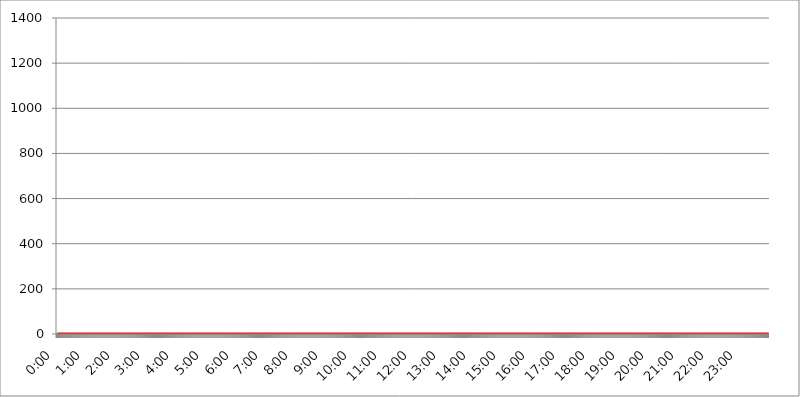
| Category | 2018.04.15. Intenzitás [W/m^2] |
|---|---|
| 0.0 | 0 |
| 0.0006944444444444445 | 0 |
| 0.001388888888888889 | 0 |
| 0.0020833333333333333 | 0 |
| 0.002777777777777778 | 0 |
| 0.003472222222222222 | 0 |
| 0.004166666666666667 | 0 |
| 0.004861111111111111 | 0 |
| 0.005555555555555556 | 0 |
| 0.0062499999999999995 | 0 |
| 0.006944444444444444 | 0 |
| 0.007638888888888889 | 0 |
| 0.008333333333333333 | 0 |
| 0.009027777777777779 | 0 |
| 0.009722222222222222 | 0 |
| 0.010416666666666666 | 0 |
| 0.011111111111111112 | 0 |
| 0.011805555555555555 | 0 |
| 0.012499999999999999 | 0 |
| 0.013194444444444444 | 0 |
| 0.013888888888888888 | 0 |
| 0.014583333333333332 | 0 |
| 0.015277777777777777 | 0 |
| 0.015972222222222224 | 0 |
| 0.016666666666666666 | 0 |
| 0.017361111111111112 | 0 |
| 0.018055555555555557 | 0 |
| 0.01875 | 0 |
| 0.019444444444444445 | 0 |
| 0.02013888888888889 | 0 |
| 0.020833333333333332 | 0 |
| 0.02152777777777778 | 0 |
| 0.022222222222222223 | 0 |
| 0.02291666666666667 | 0 |
| 0.02361111111111111 | 0 |
| 0.024305555555555556 | 0 |
| 0.024999999999999998 | 0 |
| 0.025694444444444447 | 0 |
| 0.02638888888888889 | 0 |
| 0.027083333333333334 | 0 |
| 0.027777777777777776 | 0 |
| 0.02847222222222222 | 0 |
| 0.029166666666666664 | 0 |
| 0.029861111111111113 | 0 |
| 0.030555555555555555 | 0 |
| 0.03125 | 0 |
| 0.03194444444444445 | 0 |
| 0.03263888888888889 | 0 |
| 0.03333333333333333 | 0 |
| 0.034027777777777775 | 0 |
| 0.034722222222222224 | 0 |
| 0.035416666666666666 | 0 |
| 0.036111111111111115 | 0 |
| 0.03680555555555556 | 0 |
| 0.0375 | 0 |
| 0.03819444444444444 | 0 |
| 0.03888888888888889 | 0 |
| 0.03958333333333333 | 0 |
| 0.04027777777777778 | 0 |
| 0.04097222222222222 | 0 |
| 0.041666666666666664 | 0 |
| 0.042361111111111106 | 0 |
| 0.04305555555555556 | 0 |
| 0.043750000000000004 | 0 |
| 0.044444444444444446 | 0 |
| 0.04513888888888889 | 0 |
| 0.04583333333333334 | 0 |
| 0.04652777777777778 | 0 |
| 0.04722222222222222 | 0 |
| 0.04791666666666666 | 0 |
| 0.04861111111111111 | 0 |
| 0.049305555555555554 | 0 |
| 0.049999999999999996 | 0 |
| 0.05069444444444445 | 0 |
| 0.051388888888888894 | 0 |
| 0.052083333333333336 | 0 |
| 0.05277777777777778 | 0 |
| 0.05347222222222222 | 0 |
| 0.05416666666666667 | 0 |
| 0.05486111111111111 | 0 |
| 0.05555555555555555 | 0 |
| 0.05625 | 0 |
| 0.05694444444444444 | 0 |
| 0.057638888888888885 | 0 |
| 0.05833333333333333 | 0 |
| 0.05902777777777778 | 0 |
| 0.059722222222222225 | 0 |
| 0.06041666666666667 | 0 |
| 0.061111111111111116 | 0 |
| 0.06180555555555556 | 0 |
| 0.0625 | 0 |
| 0.06319444444444444 | 0 |
| 0.06388888888888888 | 0 |
| 0.06458333333333334 | 0 |
| 0.06527777777777778 | 0 |
| 0.06597222222222222 | 0 |
| 0.06666666666666667 | 0 |
| 0.06736111111111111 | 0 |
| 0.06805555555555555 | 0 |
| 0.06874999999999999 | 0 |
| 0.06944444444444443 | 0 |
| 0.07013888888888889 | 0 |
| 0.07083333333333333 | 0 |
| 0.07152777777777779 | 0 |
| 0.07222222222222223 | 0 |
| 0.07291666666666667 | 0 |
| 0.07361111111111111 | 0 |
| 0.07430555555555556 | 0 |
| 0.075 | 0 |
| 0.07569444444444444 | 0 |
| 0.0763888888888889 | 0 |
| 0.07708333333333334 | 0 |
| 0.07777777777777778 | 0 |
| 0.07847222222222222 | 0 |
| 0.07916666666666666 | 0 |
| 0.0798611111111111 | 0 |
| 0.08055555555555556 | 0 |
| 0.08125 | 0 |
| 0.08194444444444444 | 0 |
| 0.08263888888888889 | 0 |
| 0.08333333333333333 | 0 |
| 0.08402777777777777 | 0 |
| 0.08472222222222221 | 0 |
| 0.08541666666666665 | 0 |
| 0.08611111111111112 | 0 |
| 0.08680555555555557 | 0 |
| 0.08750000000000001 | 0 |
| 0.08819444444444445 | 0 |
| 0.08888888888888889 | 0 |
| 0.08958333333333333 | 0 |
| 0.09027777777777778 | 0 |
| 0.09097222222222222 | 0 |
| 0.09166666666666667 | 0 |
| 0.09236111111111112 | 0 |
| 0.09305555555555556 | 0 |
| 0.09375 | 0 |
| 0.09444444444444444 | 0 |
| 0.09513888888888888 | 0 |
| 0.09583333333333333 | 0 |
| 0.09652777777777777 | 0 |
| 0.09722222222222222 | 0 |
| 0.09791666666666667 | 0 |
| 0.09861111111111111 | 0 |
| 0.09930555555555555 | 0 |
| 0.09999999999999999 | 0 |
| 0.10069444444444443 | 0 |
| 0.1013888888888889 | 0 |
| 0.10208333333333335 | 0 |
| 0.10277777777777779 | 0 |
| 0.10347222222222223 | 0 |
| 0.10416666666666667 | 0 |
| 0.10486111111111111 | 0 |
| 0.10555555555555556 | 0 |
| 0.10625 | 0 |
| 0.10694444444444444 | 0 |
| 0.1076388888888889 | 0 |
| 0.10833333333333334 | 0 |
| 0.10902777777777778 | 0 |
| 0.10972222222222222 | 0 |
| 0.1111111111111111 | 0 |
| 0.11180555555555556 | 0 |
| 0.11180555555555556 | 0 |
| 0.1125 | 0 |
| 0.11319444444444444 | 0 |
| 0.11388888888888889 | 0 |
| 0.11458333333333333 | 0 |
| 0.11527777777777777 | 0 |
| 0.11597222222222221 | 0 |
| 0.11666666666666665 | 0 |
| 0.1173611111111111 | 0 |
| 0.11805555555555557 | 0 |
| 0.11944444444444445 | 0 |
| 0.12013888888888889 | 0 |
| 0.12083333333333333 | 0 |
| 0.12152777777777778 | 0 |
| 0.12222222222222223 | 0 |
| 0.12291666666666667 | 0 |
| 0.12291666666666667 | 0 |
| 0.12361111111111112 | 0 |
| 0.12430555555555556 | 0 |
| 0.125 | 0 |
| 0.12569444444444444 | 0 |
| 0.12638888888888888 | 0 |
| 0.12708333333333333 | 0 |
| 0.16875 | 0 |
| 0.12847222222222224 | 0 |
| 0.12916666666666668 | 0 |
| 0.12986111111111112 | 0 |
| 0.13055555555555556 | 0 |
| 0.13125 | 0 |
| 0.13194444444444445 | 0 |
| 0.1326388888888889 | 0 |
| 0.13333333333333333 | 0 |
| 0.13402777777777777 | 0 |
| 0.13402777777777777 | 0 |
| 0.13472222222222222 | 0 |
| 0.13541666666666666 | 0 |
| 0.1361111111111111 | 0 |
| 0.13749999999999998 | 0 |
| 0.13819444444444443 | 0 |
| 0.1388888888888889 | 0 |
| 0.13958333333333334 | 0 |
| 0.14027777777777778 | 0 |
| 0.14097222222222222 | 0 |
| 0.14166666666666666 | 0 |
| 0.1423611111111111 | 0 |
| 0.14305555555555557 | 0 |
| 0.14375000000000002 | 0 |
| 0.14444444444444446 | 0 |
| 0.1451388888888889 | 0 |
| 0.1451388888888889 | 0 |
| 0.14652777777777778 | 0 |
| 0.14722222222222223 | 0 |
| 0.14791666666666667 | 0 |
| 0.1486111111111111 | 0 |
| 0.14930555555555555 | 0 |
| 0.15 | 0 |
| 0.15069444444444444 | 0 |
| 0.15138888888888888 | 0 |
| 0.15208333333333332 | 0 |
| 0.15277777777777776 | 0 |
| 0.15347222222222223 | 0 |
| 0.15416666666666667 | 0 |
| 0.15486111111111112 | 0 |
| 0.15555555555555556 | 0 |
| 0.15625 | 0 |
| 0.15694444444444444 | 0 |
| 0.15763888888888888 | 0 |
| 0.15833333333333333 | 0 |
| 0.15902777777777777 | 0 |
| 0.15972222222222224 | 0 |
| 0.16041666666666668 | 0 |
| 0.16111111111111112 | 0 |
| 0.16180555555555556 | 0 |
| 0.1625 | 0 |
| 0.16319444444444445 | 0 |
| 0.1638888888888889 | 0 |
| 0.16458333333333333 | 0 |
| 0.16527777777777777 | 0 |
| 0.16597222222222222 | 0 |
| 0.16666666666666666 | 0 |
| 0.1673611111111111 | 0 |
| 0.16805555555555554 | 0 |
| 0.16874999999999998 | 0 |
| 0.16944444444444443 | 0 |
| 0.17013888888888887 | 0 |
| 0.1708333333333333 | 0 |
| 0.17152777777777775 | 0 |
| 0.17222222222222225 | 0 |
| 0.1729166666666667 | 0 |
| 0.17361111111111113 | 0 |
| 0.17430555555555557 | 0 |
| 0.17500000000000002 | 0 |
| 0.17569444444444446 | 0 |
| 0.1763888888888889 | 0 |
| 0.17708333333333334 | 0 |
| 0.17777777777777778 | 0 |
| 0.17847222222222223 | 0 |
| 0.17916666666666667 | 0 |
| 0.1798611111111111 | 0 |
| 0.18055555555555555 | 0 |
| 0.18125 | 0 |
| 0.18194444444444444 | 0 |
| 0.1826388888888889 | 0 |
| 0.18333333333333335 | 0 |
| 0.1840277777777778 | 0 |
| 0.18472222222222223 | 0 |
| 0.18541666666666667 | 0 |
| 0.18611111111111112 | 0 |
| 0.18680555555555556 | 0 |
| 0.1875 | 0 |
| 0.18819444444444444 | 0 |
| 0.18888888888888888 | 0 |
| 0.18958333333333333 | 0 |
| 0.19027777777777777 | 0 |
| 0.1909722222222222 | 0 |
| 0.19166666666666665 | 0 |
| 0.19236111111111112 | 0 |
| 0.19305555555555554 | 0 |
| 0.19375 | 0 |
| 0.19444444444444445 | 0 |
| 0.1951388888888889 | 0 |
| 0.19583333333333333 | 0 |
| 0.19652777777777777 | 0 |
| 0.19722222222222222 | 0 |
| 0.19791666666666666 | 0 |
| 0.1986111111111111 | 0 |
| 0.19930555555555554 | 0 |
| 0.19999999999999998 | 0 |
| 0.20069444444444443 | 0 |
| 0.20138888888888887 | 0 |
| 0.2020833333333333 | 0 |
| 0.2027777777777778 | 0 |
| 0.2034722222222222 | 0 |
| 0.2041666666666667 | 0 |
| 0.20486111111111113 | 0 |
| 0.20555555555555557 | 0 |
| 0.20625000000000002 | 0 |
| 0.20694444444444446 | 0 |
| 0.2076388888888889 | 0 |
| 0.20833333333333334 | 0 |
| 0.20902777777777778 | 0 |
| 0.20972222222222223 | 0 |
| 0.21041666666666667 | 0 |
| 0.2111111111111111 | 0 |
| 0.21180555555555555 | 0 |
| 0.2125 | 0 |
| 0.21319444444444444 | 0 |
| 0.2138888888888889 | 0 |
| 0.21458333333333335 | 0 |
| 0.2152777777777778 | 0 |
| 0.21597222222222223 | 0 |
| 0.21666666666666667 | 0 |
| 0.21736111111111112 | 0 |
| 0.21805555555555556 | 0 |
| 0.21875 | 0 |
| 0.21944444444444444 | 0 |
| 0.22013888888888888 | 0 |
| 0.22083333333333333 | 0 |
| 0.22152777777777777 | 0 |
| 0.2222222222222222 | 0 |
| 0.22291666666666665 | 0 |
| 0.2236111111111111 | 0 |
| 0.22430555555555556 | 0 |
| 0.225 | 0 |
| 0.22569444444444445 | 0 |
| 0.2263888888888889 | 0 |
| 0.22708333333333333 | 0 |
| 0.22777777777777777 | 0 |
| 0.22847222222222222 | 0 |
| 0.22916666666666666 | 0 |
| 0.2298611111111111 | 0 |
| 0.23055555555555554 | 0 |
| 0.23124999999999998 | 0 |
| 0.23194444444444443 | 0 |
| 0.23263888888888887 | 0 |
| 0.2333333333333333 | 0 |
| 0.2340277777777778 | 0 |
| 0.2347222222222222 | 0 |
| 0.2354166666666667 | 0 |
| 0.23611111111111113 | 0 |
| 0.23680555555555557 | 0 |
| 0.23750000000000002 | 0 |
| 0.23819444444444446 | 0 |
| 0.2388888888888889 | 0 |
| 0.23958333333333334 | 0 |
| 0.24027777777777778 | 0 |
| 0.24097222222222223 | 0 |
| 0.24166666666666667 | 0 |
| 0.2423611111111111 | 0 |
| 0.24305555555555555 | 0 |
| 0.24375 | 0 |
| 0.24444444444444446 | 0 |
| 0.24513888888888888 | 0 |
| 0.24583333333333335 | 0 |
| 0.2465277777777778 | 0 |
| 0.24722222222222223 | 0 |
| 0.24791666666666667 | 0 |
| 0.24861111111111112 | 0 |
| 0.24930555555555556 | 0 |
| 0.25 | 0 |
| 0.25069444444444444 | 0 |
| 0.2513888888888889 | 0 |
| 0.2520833333333333 | 0 |
| 0.25277777777777777 | 0 |
| 0.2534722222222222 | 0 |
| 0.25416666666666665 | 0 |
| 0.2548611111111111 | 0 |
| 0.2555555555555556 | 0 |
| 0.25625000000000003 | 0 |
| 0.2569444444444445 | 0 |
| 0.2576388888888889 | 0 |
| 0.25833333333333336 | 0 |
| 0.2590277777777778 | 0 |
| 0.25972222222222224 | 0 |
| 0.2604166666666667 | 0 |
| 0.2611111111111111 | 0 |
| 0.26180555555555557 | 0 |
| 0.2625 | 0 |
| 0.26319444444444445 | 0 |
| 0.2638888888888889 | 0 |
| 0.26458333333333334 | 0 |
| 0.2652777777777778 | 0 |
| 0.2659722222222222 | 0 |
| 0.26666666666666666 | 0 |
| 0.2673611111111111 | 0 |
| 0.26805555555555555 | 0 |
| 0.26875 | 0 |
| 0.26944444444444443 | 0 |
| 0.2701388888888889 | 0 |
| 0.2708333333333333 | 0 |
| 0.27152777777777776 | 0 |
| 0.2722222222222222 | 0 |
| 0.27291666666666664 | 0 |
| 0.2736111111111111 | 0 |
| 0.2743055555555555 | 0 |
| 0.27499999999999997 | 0 |
| 0.27569444444444446 | 0 |
| 0.27638888888888885 | 0 |
| 0.27708333333333335 | 0 |
| 0.2777777777777778 | 0 |
| 0.27847222222222223 | 0 |
| 0.2791666666666667 | 0 |
| 0.2798611111111111 | 0 |
| 0.28055555555555556 | 0 |
| 0.28125 | 0 |
| 0.28194444444444444 | 0 |
| 0.2826388888888889 | 0 |
| 0.2833333333333333 | 0 |
| 0.28402777777777777 | 0 |
| 0.2847222222222222 | 0 |
| 0.28541666666666665 | 0 |
| 0.28611111111111115 | 0 |
| 0.28680555555555554 | 0 |
| 0.28750000000000003 | 0 |
| 0.2881944444444445 | 0 |
| 0.2888888888888889 | 0 |
| 0.28958333333333336 | 0 |
| 0.2902777777777778 | 0 |
| 0.29097222222222224 | 0 |
| 0.2916666666666667 | 0 |
| 0.2923611111111111 | 0 |
| 0.29305555555555557 | 0 |
| 0.29375 | 0 |
| 0.29444444444444445 | 0 |
| 0.2951388888888889 | 0 |
| 0.29583333333333334 | 0 |
| 0.2965277777777778 | 0 |
| 0.2972222222222222 | 0 |
| 0.29791666666666666 | 0 |
| 0.2986111111111111 | 0 |
| 0.29930555555555555 | 0 |
| 0.3 | 0 |
| 0.30069444444444443 | 0 |
| 0.3013888888888889 | 0 |
| 0.3020833333333333 | 0 |
| 0.30277777777777776 | 0 |
| 0.3034722222222222 | 0 |
| 0.30416666666666664 | 0 |
| 0.3048611111111111 | 0 |
| 0.3055555555555555 | 0 |
| 0.30624999999999997 | 0 |
| 0.3069444444444444 | 0 |
| 0.3076388888888889 | 0 |
| 0.30833333333333335 | 0 |
| 0.3090277777777778 | 0 |
| 0.30972222222222223 | 0 |
| 0.3104166666666667 | 0 |
| 0.3111111111111111 | 0 |
| 0.31180555555555556 | 0 |
| 0.3125 | 0 |
| 0.31319444444444444 | 0 |
| 0.3138888888888889 | 0 |
| 0.3145833333333333 | 0 |
| 0.31527777777777777 | 0 |
| 0.3159722222222222 | 0 |
| 0.31666666666666665 | 0 |
| 0.31736111111111115 | 0 |
| 0.31805555555555554 | 0 |
| 0.31875000000000003 | 0 |
| 0.3194444444444445 | 0 |
| 0.3201388888888889 | 0 |
| 0.32083333333333336 | 0 |
| 0.3215277777777778 | 0 |
| 0.32222222222222224 | 0 |
| 0.3229166666666667 | 0 |
| 0.3236111111111111 | 0 |
| 0.32430555555555557 | 0 |
| 0.325 | 0 |
| 0.32569444444444445 | 0 |
| 0.3263888888888889 | 0 |
| 0.32708333333333334 | 0 |
| 0.3277777777777778 | 0 |
| 0.3284722222222222 | 0 |
| 0.32916666666666666 | 0 |
| 0.3298611111111111 | 0 |
| 0.33055555555555555 | 0 |
| 0.33125 | 0 |
| 0.33194444444444443 | 0 |
| 0.3326388888888889 | 0 |
| 0.3333333333333333 | 0 |
| 0.3340277777777778 | 0 |
| 0.3347222222222222 | 0 |
| 0.3354166666666667 | 0 |
| 0.3361111111111111 | 0 |
| 0.3368055555555556 | 0 |
| 0.33749999999999997 | 0 |
| 0.33819444444444446 | 0 |
| 0.33888888888888885 | 0 |
| 0.33958333333333335 | 0 |
| 0.34027777777777773 | 0 |
| 0.34097222222222223 | 0 |
| 0.3416666666666666 | 0 |
| 0.3423611111111111 | 0 |
| 0.3430555555555555 | 0 |
| 0.34375 | 0 |
| 0.3444444444444445 | 0 |
| 0.3451388888888889 | 0 |
| 0.3458333333333334 | 0 |
| 0.34652777777777777 | 0 |
| 0.34722222222222227 | 0 |
| 0.34791666666666665 | 0 |
| 0.34861111111111115 | 0 |
| 0.34930555555555554 | 0 |
| 0.35000000000000003 | 0 |
| 0.3506944444444444 | 0 |
| 0.3513888888888889 | 0 |
| 0.3520833333333333 | 0 |
| 0.3527777777777778 | 0 |
| 0.3534722222222222 | 0 |
| 0.3541666666666667 | 0 |
| 0.3548611111111111 | 0 |
| 0.35555555555555557 | 0 |
| 0.35625 | 0 |
| 0.35694444444444445 | 0 |
| 0.3576388888888889 | 0 |
| 0.35833333333333334 | 0 |
| 0.3590277777777778 | 0 |
| 0.3597222222222222 | 0 |
| 0.36041666666666666 | 0 |
| 0.3611111111111111 | 0 |
| 0.36180555555555555 | 0 |
| 0.3625 | 0 |
| 0.36319444444444443 | 0 |
| 0.3638888888888889 | 0 |
| 0.3645833333333333 | 0 |
| 0.3652777777777778 | 0 |
| 0.3659722222222222 | 0 |
| 0.3666666666666667 | 0 |
| 0.3673611111111111 | 0 |
| 0.3680555555555556 | 0 |
| 0.36874999999999997 | 0 |
| 0.36944444444444446 | 0 |
| 0.37013888888888885 | 0 |
| 0.37083333333333335 | 0 |
| 0.37152777777777773 | 0 |
| 0.37222222222222223 | 0 |
| 0.3729166666666666 | 0 |
| 0.3736111111111111 | 0 |
| 0.3743055555555555 | 0 |
| 0.375 | 0 |
| 0.3756944444444445 | 0 |
| 0.3763888888888889 | 0 |
| 0.3770833333333334 | 0 |
| 0.37777777777777777 | 0 |
| 0.37847222222222227 | 0 |
| 0.37916666666666665 | 0 |
| 0.37986111111111115 | 0 |
| 0.38055555555555554 | 0 |
| 0.38125000000000003 | 0 |
| 0.3819444444444444 | 0 |
| 0.3826388888888889 | 0 |
| 0.3833333333333333 | 0 |
| 0.3840277777777778 | 0 |
| 0.3847222222222222 | 0 |
| 0.3854166666666667 | 0 |
| 0.3861111111111111 | 0 |
| 0.38680555555555557 | 0 |
| 0.3875 | 0 |
| 0.38819444444444445 | 0 |
| 0.3888888888888889 | 0 |
| 0.38958333333333334 | 0 |
| 0.3902777777777778 | 0 |
| 0.3909722222222222 | 0 |
| 0.39166666666666666 | 0 |
| 0.3923611111111111 | 0 |
| 0.39305555555555555 | 0 |
| 0.39375 | 0 |
| 0.39444444444444443 | 0 |
| 0.3951388888888889 | 0 |
| 0.3958333333333333 | 0 |
| 0.3965277777777778 | 0 |
| 0.3972222222222222 | 0 |
| 0.3979166666666667 | 0 |
| 0.3986111111111111 | 0 |
| 0.3993055555555556 | 0 |
| 0.39999999999999997 | 0 |
| 0.40069444444444446 | 0 |
| 0.40138888888888885 | 0 |
| 0.40208333333333335 | 0 |
| 0.40277777777777773 | 0 |
| 0.40347222222222223 | 0 |
| 0.4041666666666666 | 0 |
| 0.4048611111111111 | 0 |
| 0.4055555555555555 | 0 |
| 0.40625 | 0 |
| 0.4069444444444445 | 0 |
| 0.4076388888888889 | 0 |
| 0.4083333333333334 | 0 |
| 0.40902777777777777 | 0 |
| 0.40972222222222227 | 0 |
| 0.41041666666666665 | 0 |
| 0.41111111111111115 | 0 |
| 0.41180555555555554 | 0 |
| 0.41250000000000003 | 0 |
| 0.4131944444444444 | 0 |
| 0.4138888888888889 | 0 |
| 0.4145833333333333 | 0 |
| 0.4152777777777778 | 0 |
| 0.4159722222222222 | 0 |
| 0.4166666666666667 | 0 |
| 0.4173611111111111 | 0 |
| 0.41805555555555557 | 0 |
| 0.41875 | 0 |
| 0.41944444444444445 | 0 |
| 0.4201388888888889 | 0 |
| 0.42083333333333334 | 0 |
| 0.4215277777777778 | 0 |
| 0.4222222222222222 | 0 |
| 0.42291666666666666 | 0 |
| 0.4236111111111111 | 0 |
| 0.42430555555555555 | 0 |
| 0.425 | 0 |
| 0.42569444444444443 | 0 |
| 0.4263888888888889 | 0 |
| 0.4270833333333333 | 0 |
| 0.4277777777777778 | 0 |
| 0.4284722222222222 | 0 |
| 0.4291666666666667 | 0 |
| 0.4298611111111111 | 0 |
| 0.4305555555555556 | 0 |
| 0.43124999999999997 | 0 |
| 0.43194444444444446 | 0 |
| 0.43263888888888885 | 0 |
| 0.43333333333333335 | 0 |
| 0.43402777777777773 | 0 |
| 0.43472222222222223 | 0 |
| 0.4354166666666666 | 0 |
| 0.4361111111111111 | 0 |
| 0.4368055555555555 | 0 |
| 0.4375 | 0 |
| 0.4381944444444445 | 0 |
| 0.4388888888888889 | 0 |
| 0.4395833333333334 | 0 |
| 0.44027777777777777 | 0 |
| 0.44097222222222227 | 0 |
| 0.44166666666666665 | 0 |
| 0.44236111111111115 | 0 |
| 0.44305555555555554 | 0 |
| 0.44375000000000003 | 0 |
| 0.4444444444444444 | 0 |
| 0.4451388888888889 | 0 |
| 0.4458333333333333 | 0 |
| 0.4465277777777778 | 0 |
| 0.4472222222222222 | 0 |
| 0.4479166666666667 | 0 |
| 0.4486111111111111 | 0 |
| 0.44930555555555557 | 0 |
| 0.45 | 0 |
| 0.45069444444444445 | 0 |
| 0.4513888888888889 | 0 |
| 0.45208333333333334 | 0 |
| 0.4527777777777778 | 0 |
| 0.4534722222222222 | 0 |
| 0.45416666666666666 | 0 |
| 0.4548611111111111 | 0 |
| 0.45555555555555555 | 0 |
| 0.45625 | 0 |
| 0.45694444444444443 | 0 |
| 0.4576388888888889 | 0 |
| 0.4583333333333333 | 0 |
| 0.4590277777777778 | 0 |
| 0.4597222222222222 | 0 |
| 0.4604166666666667 | 0 |
| 0.4611111111111111 | 0 |
| 0.4618055555555556 | 0 |
| 0.46249999999999997 | 0 |
| 0.46319444444444446 | 0 |
| 0.46388888888888885 | 0 |
| 0.46458333333333335 | 0 |
| 0.46527777777777773 | 0 |
| 0.46597222222222223 | 0 |
| 0.4666666666666666 | 0 |
| 0.4673611111111111 | 0 |
| 0.4680555555555555 | 0 |
| 0.46875 | 0 |
| 0.4694444444444445 | 0 |
| 0.4701388888888889 | 0 |
| 0.4708333333333334 | 0 |
| 0.47152777777777777 | 0 |
| 0.47222222222222227 | 0 |
| 0.47291666666666665 | 0 |
| 0.47361111111111115 | 0 |
| 0.47430555555555554 | 0 |
| 0.47500000000000003 | 0 |
| 0.4756944444444444 | 0 |
| 0.4763888888888889 | 0 |
| 0.4770833333333333 | 0 |
| 0.4777777777777778 | 0 |
| 0.4784722222222222 | 0 |
| 0.4791666666666667 | 0 |
| 0.4798611111111111 | 0 |
| 0.48055555555555557 | 0 |
| 0.48125 | 0 |
| 0.48194444444444445 | 0 |
| 0.4826388888888889 | 0 |
| 0.48333333333333334 | 0 |
| 0.4840277777777778 | 0 |
| 0.4847222222222222 | 0 |
| 0.48541666666666666 | 0 |
| 0.4861111111111111 | 0 |
| 0.48680555555555555 | 0 |
| 0.4875 | 0 |
| 0.48819444444444443 | 0 |
| 0.4888888888888889 | 0 |
| 0.4895833333333333 | 0 |
| 0.4902777777777778 | 0 |
| 0.4909722222222222 | 0 |
| 0.4916666666666667 | 0 |
| 0.4923611111111111 | 0 |
| 0.4930555555555556 | 0 |
| 0.49374999999999997 | 0 |
| 0.49444444444444446 | 0 |
| 0.49513888888888885 | 0 |
| 0.49583333333333335 | 0 |
| 0.49652777777777773 | 0 |
| 0.49722222222222223 | 0 |
| 0.4979166666666666 | 0 |
| 0.4986111111111111 | 0 |
| 0.4993055555555555 | 0 |
| 0.5 | 0 |
| 0.5006944444444444 | 0 |
| 0.5013888888888889 | 0 |
| 0.5020833333333333 | 0 |
| 0.5027777777777778 | 0 |
| 0.5034722222222222 | 0 |
| 0.5041666666666667 | 0 |
| 0.5048611111111111 | 0 |
| 0.5055555555555555 | 0 |
| 0.50625 | 0 |
| 0.5069444444444444 | 0 |
| 0.5076388888888889 | 0 |
| 0.5083333333333333 | 0 |
| 0.5090277777777777 | 0 |
| 0.5097222222222222 | 0 |
| 0.5104166666666666 | 0 |
| 0.5111111111111112 | 0 |
| 0.5118055555555555 | 0 |
| 0.5125000000000001 | 0 |
| 0.5131944444444444 | 0 |
| 0.513888888888889 | 0 |
| 0.5145833333333333 | 0 |
| 0.5152777777777778 | 0 |
| 0.5159722222222222 | 0 |
| 0.5166666666666667 | 0 |
| 0.517361111111111 | 0 |
| 0.5180555555555556 | 0 |
| 0.5187499999999999 | 0 |
| 0.5194444444444445 | 0 |
| 0.5201388888888888 | 0 |
| 0.5208333333333334 | 0 |
| 0.5215277777777778 | 0 |
| 0.5222222222222223 | 0 |
| 0.5229166666666667 | 0 |
| 0.5236111111111111 | 0 |
| 0.5243055555555556 | 0 |
| 0.525 | 0 |
| 0.5256944444444445 | 0 |
| 0.5263888888888889 | 0 |
| 0.5270833333333333 | 0 |
| 0.5277777777777778 | 0 |
| 0.5284722222222222 | 0 |
| 0.5291666666666667 | 0 |
| 0.5298611111111111 | 0 |
| 0.5305555555555556 | 0 |
| 0.53125 | 0 |
| 0.5319444444444444 | 0 |
| 0.5326388888888889 | 0 |
| 0.5333333333333333 | 0 |
| 0.5340277777777778 | 0 |
| 0.5347222222222222 | 0 |
| 0.5354166666666667 | 0 |
| 0.5361111111111111 | 0 |
| 0.5368055555555555 | 0 |
| 0.5375 | 0 |
| 0.5381944444444444 | 0 |
| 0.5388888888888889 | 0 |
| 0.5395833333333333 | 0 |
| 0.5402777777777777 | 0 |
| 0.5409722222222222 | 0 |
| 0.5416666666666666 | 0 |
| 0.5423611111111112 | 0 |
| 0.5430555555555555 | 0 |
| 0.5437500000000001 | 0 |
| 0.5444444444444444 | 0 |
| 0.545138888888889 | 0 |
| 0.5458333333333333 | 0 |
| 0.5465277777777778 | 0 |
| 0.5472222222222222 | 0 |
| 0.5479166666666667 | 0 |
| 0.548611111111111 | 0 |
| 0.5493055555555556 | 0 |
| 0.5499999999999999 | 0 |
| 0.5506944444444445 | 0 |
| 0.5513888888888888 | 0 |
| 0.5520833333333334 | 0 |
| 0.5527777777777778 | 0 |
| 0.5534722222222223 | 0 |
| 0.5541666666666667 | 0 |
| 0.5548611111111111 | 0 |
| 0.5555555555555556 | 0 |
| 0.55625 | 0 |
| 0.5569444444444445 | 0 |
| 0.5576388888888889 | 0 |
| 0.5583333333333333 | 0 |
| 0.5590277777777778 | 0 |
| 0.5597222222222222 | 0 |
| 0.5604166666666667 | 0 |
| 0.5611111111111111 | 0 |
| 0.5618055555555556 | 0 |
| 0.5625 | 0 |
| 0.5631944444444444 | 0 |
| 0.5638888888888889 | 0 |
| 0.5645833333333333 | 0 |
| 0.5652777777777778 | 0 |
| 0.5659722222222222 | 0 |
| 0.5666666666666667 | 0 |
| 0.5673611111111111 | 0 |
| 0.5680555555555555 | 0 |
| 0.56875 | 0 |
| 0.5694444444444444 | 0 |
| 0.5701388888888889 | 0 |
| 0.5708333333333333 | 0 |
| 0.5715277777777777 | 0 |
| 0.5722222222222222 | 0 |
| 0.5729166666666666 | 0 |
| 0.5736111111111112 | 0 |
| 0.5743055555555555 | 0 |
| 0.5750000000000001 | 0 |
| 0.5756944444444444 | 0 |
| 0.576388888888889 | 0 |
| 0.5770833333333333 | 0 |
| 0.5777777777777778 | 0 |
| 0.5784722222222222 | 0 |
| 0.5791666666666667 | 0 |
| 0.579861111111111 | 0 |
| 0.5805555555555556 | 0 |
| 0.5812499999999999 | 0 |
| 0.5819444444444445 | 0 |
| 0.5826388888888888 | 0 |
| 0.5833333333333334 | 0 |
| 0.5840277777777778 | 0 |
| 0.5847222222222223 | 0 |
| 0.5854166666666667 | 0 |
| 0.5861111111111111 | 0 |
| 0.5868055555555556 | 0 |
| 0.5875 | 0 |
| 0.5881944444444445 | 0 |
| 0.5888888888888889 | 0 |
| 0.5895833333333333 | 0 |
| 0.5902777777777778 | 0 |
| 0.5909722222222222 | 0 |
| 0.5916666666666667 | 0 |
| 0.5923611111111111 | 0 |
| 0.5930555555555556 | 0 |
| 0.59375 | 0 |
| 0.5944444444444444 | 0 |
| 0.5951388888888889 | 0 |
| 0.5958333333333333 | 0 |
| 0.5965277777777778 | 0 |
| 0.5972222222222222 | 0 |
| 0.5979166666666667 | 0 |
| 0.5986111111111111 | 0 |
| 0.5993055555555555 | 0 |
| 0.6 | 0 |
| 0.6006944444444444 | 0 |
| 0.6013888888888889 | 0 |
| 0.6020833333333333 | 0 |
| 0.6027777777777777 | 0 |
| 0.6034722222222222 | 0 |
| 0.6041666666666666 | 0 |
| 0.6048611111111112 | 0 |
| 0.6055555555555555 | 0 |
| 0.6062500000000001 | 0 |
| 0.6069444444444444 | 0 |
| 0.607638888888889 | 0 |
| 0.6083333333333333 | 0 |
| 0.6090277777777778 | 0 |
| 0.6097222222222222 | 0 |
| 0.6104166666666667 | 0 |
| 0.611111111111111 | 0 |
| 0.6118055555555556 | 0 |
| 0.6124999999999999 | 0 |
| 0.6131944444444445 | 0 |
| 0.6138888888888888 | 0 |
| 0.6145833333333334 | 0 |
| 0.6152777777777778 | 0 |
| 0.6159722222222223 | 0 |
| 0.6166666666666667 | 0 |
| 0.6173611111111111 | 0 |
| 0.6180555555555556 | 0 |
| 0.61875 | 0 |
| 0.6194444444444445 | 0 |
| 0.6201388888888889 | 0 |
| 0.6208333333333333 | 0 |
| 0.6215277777777778 | 0 |
| 0.6222222222222222 | 0 |
| 0.6229166666666667 | 0 |
| 0.6236111111111111 | 0 |
| 0.6243055555555556 | 0 |
| 0.625 | 0 |
| 0.6256944444444444 | 0 |
| 0.6263888888888889 | 0 |
| 0.6270833333333333 | 0 |
| 0.6277777777777778 | 0 |
| 0.6284722222222222 | 0 |
| 0.6291666666666667 | 0 |
| 0.6298611111111111 | 0 |
| 0.6305555555555555 | 0 |
| 0.63125 | 0 |
| 0.6319444444444444 | 0 |
| 0.6326388888888889 | 0 |
| 0.6333333333333333 | 0 |
| 0.6340277777777777 | 0 |
| 0.6347222222222222 | 0 |
| 0.6354166666666666 | 0 |
| 0.6361111111111112 | 0 |
| 0.6368055555555555 | 0 |
| 0.6375000000000001 | 0 |
| 0.6381944444444444 | 0 |
| 0.638888888888889 | 0 |
| 0.6395833333333333 | 0 |
| 0.6402777777777778 | 0 |
| 0.6409722222222222 | 0 |
| 0.6416666666666667 | 0 |
| 0.642361111111111 | 0 |
| 0.6430555555555556 | 0 |
| 0.6437499999999999 | 0 |
| 0.6444444444444445 | 0 |
| 0.6451388888888888 | 0 |
| 0.6458333333333334 | 0 |
| 0.6465277777777778 | 0 |
| 0.6472222222222223 | 0 |
| 0.6479166666666667 | 0 |
| 0.6486111111111111 | 0 |
| 0.6493055555555556 | 0 |
| 0.65 | 0 |
| 0.6506944444444445 | 0 |
| 0.6513888888888889 | 0 |
| 0.6520833333333333 | 0 |
| 0.6527777777777778 | 0 |
| 0.6534722222222222 | 0 |
| 0.6541666666666667 | 0 |
| 0.6548611111111111 | 0 |
| 0.6555555555555556 | 0 |
| 0.65625 | 0 |
| 0.6569444444444444 | 0 |
| 0.6576388888888889 | 0 |
| 0.6583333333333333 | 0 |
| 0.6590277777777778 | 0 |
| 0.6597222222222222 | 0 |
| 0.6604166666666667 | 0 |
| 0.6611111111111111 | 0 |
| 0.6618055555555555 | 0 |
| 0.6625 | 0 |
| 0.6631944444444444 | 0 |
| 0.6638888888888889 | 0 |
| 0.6645833333333333 | 0 |
| 0.6652777777777777 | 0 |
| 0.6659722222222222 | 0 |
| 0.6666666666666666 | 0 |
| 0.6673611111111111 | 0 |
| 0.6680555555555556 | 0 |
| 0.6687500000000001 | 0 |
| 0.6694444444444444 | 0 |
| 0.6701388888888888 | 0 |
| 0.6708333333333334 | 0 |
| 0.6715277777777778 | 0 |
| 0.6722222222222222 | 0 |
| 0.6729166666666666 | 0 |
| 0.6736111111111112 | 0 |
| 0.6743055555555556 | 0 |
| 0.6749999999999999 | 0 |
| 0.6756944444444444 | 0 |
| 0.6763888888888889 | 0 |
| 0.6770833333333334 | 0 |
| 0.6777777777777777 | 0 |
| 0.6784722222222223 | 0 |
| 0.6791666666666667 | 0 |
| 0.6798611111111111 | 0 |
| 0.6805555555555555 | 0 |
| 0.68125 | 0 |
| 0.6819444444444445 | 0 |
| 0.6826388888888889 | 0 |
| 0.6833333333333332 | 0 |
| 0.6840277777777778 | 0 |
| 0.6847222222222222 | 0 |
| 0.6854166666666667 | 0 |
| 0.686111111111111 | 0 |
| 0.6868055555555556 | 0 |
| 0.6875 | 0 |
| 0.6881944444444444 | 0 |
| 0.688888888888889 | 0 |
| 0.6895833333333333 | 0 |
| 0.6902777777777778 | 0 |
| 0.6909722222222222 | 0 |
| 0.6916666666666668 | 0 |
| 0.6923611111111111 | 0 |
| 0.6930555555555555 | 0 |
| 0.69375 | 0 |
| 0.6944444444444445 | 0 |
| 0.6951388888888889 | 0 |
| 0.6958333333333333 | 0 |
| 0.6965277777777777 | 0 |
| 0.6972222222222223 | 0 |
| 0.6979166666666666 | 0 |
| 0.6986111111111111 | 0 |
| 0.6993055555555556 | 0 |
| 0.7000000000000001 | 0 |
| 0.7006944444444444 | 0 |
| 0.7013888888888888 | 0 |
| 0.7020833333333334 | 0 |
| 0.7027777777777778 | 0 |
| 0.7034722222222222 | 0 |
| 0.7041666666666666 | 0 |
| 0.7048611111111112 | 0 |
| 0.7055555555555556 | 0 |
| 0.7062499999999999 | 0 |
| 0.7069444444444444 | 0 |
| 0.7076388888888889 | 0 |
| 0.7083333333333334 | 0 |
| 0.7090277777777777 | 0 |
| 0.7097222222222223 | 0 |
| 0.7104166666666667 | 0 |
| 0.7111111111111111 | 0 |
| 0.7118055555555555 | 0 |
| 0.7125 | 0 |
| 0.7131944444444445 | 0 |
| 0.7138888888888889 | 0 |
| 0.7145833333333332 | 0 |
| 0.7152777777777778 | 0 |
| 0.7159722222222222 | 0 |
| 0.7166666666666667 | 0 |
| 0.717361111111111 | 0 |
| 0.7180555555555556 | 0 |
| 0.71875 | 0 |
| 0.7194444444444444 | 0 |
| 0.720138888888889 | 0 |
| 0.7208333333333333 | 0 |
| 0.7215277777777778 | 0 |
| 0.7222222222222222 | 0 |
| 0.7229166666666668 | 0 |
| 0.7236111111111111 | 0 |
| 0.7243055555555555 | 0 |
| 0.725 | 0 |
| 0.7256944444444445 | 0 |
| 0.7263888888888889 | 0 |
| 0.7270833333333333 | 0 |
| 0.7277777777777777 | 0 |
| 0.7284722222222223 | 0 |
| 0.7291666666666666 | 0 |
| 0.7298611111111111 | 0 |
| 0.7305555555555556 | 0 |
| 0.7312500000000001 | 0 |
| 0.7319444444444444 | 0 |
| 0.7326388888888888 | 0 |
| 0.7333333333333334 | 0 |
| 0.7340277777777778 | 0 |
| 0.7347222222222222 | 0 |
| 0.7354166666666666 | 0 |
| 0.7361111111111112 | 0 |
| 0.7368055555555556 | 0 |
| 0.7374999999999999 | 0 |
| 0.7381944444444444 | 0 |
| 0.7388888888888889 | 0 |
| 0.7395833333333334 | 0 |
| 0.7402777777777777 | 0 |
| 0.7409722222222223 | 0 |
| 0.7416666666666667 | 0 |
| 0.7423611111111111 | 0 |
| 0.7430555555555555 | 0 |
| 0.74375 | 0 |
| 0.7444444444444445 | 0 |
| 0.7451388888888889 | 0 |
| 0.7458333333333332 | 0 |
| 0.7465277777777778 | 0 |
| 0.7472222222222222 | 0 |
| 0.7479166666666667 | 0 |
| 0.748611111111111 | 0 |
| 0.7493055555555556 | 0 |
| 0.75 | 0 |
| 0.7506944444444444 | 0 |
| 0.751388888888889 | 0 |
| 0.7520833333333333 | 0 |
| 0.7527777777777778 | 0 |
| 0.7534722222222222 | 0 |
| 0.7541666666666668 | 0 |
| 0.7548611111111111 | 0 |
| 0.7555555555555555 | 0 |
| 0.75625 | 0 |
| 0.7569444444444445 | 0 |
| 0.7576388888888889 | 0 |
| 0.7583333333333333 | 0 |
| 0.7590277777777777 | 0 |
| 0.7597222222222223 | 0 |
| 0.7604166666666666 | 0 |
| 0.7611111111111111 | 0 |
| 0.7618055555555556 | 0 |
| 0.7625000000000001 | 0 |
| 0.7631944444444444 | 0 |
| 0.7638888888888888 | 0 |
| 0.7645833333333334 | 0 |
| 0.7652777777777778 | 0 |
| 0.7659722222222222 | 0 |
| 0.7666666666666666 | 0 |
| 0.7673611111111112 | 0 |
| 0.7680555555555556 | 0 |
| 0.7687499999999999 | 0 |
| 0.7694444444444444 | 0 |
| 0.7701388888888889 | 0 |
| 0.7708333333333334 | 0 |
| 0.7715277777777777 | 0 |
| 0.7722222222222223 | 0 |
| 0.7729166666666667 | 0 |
| 0.7736111111111111 | 0 |
| 0.7743055555555555 | 0 |
| 0.775 | 0 |
| 0.7756944444444445 | 0 |
| 0.7763888888888889 | 0 |
| 0.7770833333333332 | 0 |
| 0.7777777777777778 | 0 |
| 0.7784722222222222 | 0 |
| 0.7791666666666667 | 0 |
| 0.779861111111111 | 0 |
| 0.7805555555555556 | 0 |
| 0.78125 | 0 |
| 0.7819444444444444 | 0 |
| 0.782638888888889 | 0 |
| 0.7833333333333333 | 0 |
| 0.7840277777777778 | 0 |
| 0.7847222222222222 | 0 |
| 0.7854166666666668 | 0 |
| 0.7861111111111111 | 0 |
| 0.7868055555555555 | 0 |
| 0.7875 | 0 |
| 0.7881944444444445 | 0 |
| 0.7888888888888889 | 0 |
| 0.7895833333333333 | 0 |
| 0.7902777777777777 | 0 |
| 0.7909722222222223 | 0 |
| 0.7916666666666666 | 0 |
| 0.7923611111111111 | 0 |
| 0.7930555555555556 | 0 |
| 0.7937500000000001 | 0 |
| 0.7944444444444444 | 0 |
| 0.7951388888888888 | 0 |
| 0.7958333333333334 | 0 |
| 0.7965277777777778 | 0 |
| 0.7972222222222222 | 0 |
| 0.7979166666666666 | 0 |
| 0.7986111111111112 | 0 |
| 0.7993055555555556 | 0 |
| 0.7999999999999999 | 0 |
| 0.8006944444444444 | 0 |
| 0.8013888888888889 | 0 |
| 0.8020833333333334 | 0 |
| 0.8027777777777777 | 0 |
| 0.8034722222222223 | 0 |
| 0.8041666666666667 | 0 |
| 0.8048611111111111 | 0 |
| 0.8055555555555555 | 0 |
| 0.80625 | 0 |
| 0.8069444444444445 | 0 |
| 0.8076388888888889 | 0 |
| 0.8083333333333332 | 0 |
| 0.8090277777777778 | 0 |
| 0.8097222222222222 | 0 |
| 0.8104166666666667 | 0 |
| 0.811111111111111 | 0 |
| 0.8118055555555556 | 0 |
| 0.8125 | 0 |
| 0.8131944444444444 | 0 |
| 0.813888888888889 | 0 |
| 0.8145833333333333 | 0 |
| 0.8152777777777778 | 0 |
| 0.8159722222222222 | 0 |
| 0.8166666666666668 | 0 |
| 0.8173611111111111 | 0 |
| 0.8180555555555555 | 0 |
| 0.81875 | 0 |
| 0.8194444444444445 | 0 |
| 0.8201388888888889 | 0 |
| 0.8208333333333333 | 0 |
| 0.8215277777777777 | 0 |
| 0.8222222222222223 | 0 |
| 0.8229166666666666 | 0 |
| 0.8236111111111111 | 0 |
| 0.8243055555555556 | 0 |
| 0.8250000000000001 | 0 |
| 0.8256944444444444 | 0 |
| 0.8263888888888888 | 0 |
| 0.8270833333333334 | 0 |
| 0.8277777777777778 | 0 |
| 0.8284722222222222 | 0 |
| 0.8291666666666666 | 0 |
| 0.8298611111111112 | 0 |
| 0.8305555555555556 | 0 |
| 0.8312499999999999 | 0 |
| 0.8319444444444444 | 0 |
| 0.8326388888888889 | 0 |
| 0.8333333333333334 | 0 |
| 0.8340277777777777 | 0 |
| 0.8347222222222223 | 0 |
| 0.8354166666666667 | 0 |
| 0.8361111111111111 | 0 |
| 0.8368055555555555 | 0 |
| 0.8375 | 0 |
| 0.8381944444444445 | 0 |
| 0.8388888888888889 | 0 |
| 0.8395833333333332 | 0 |
| 0.8402777777777778 | 0 |
| 0.8409722222222222 | 0 |
| 0.8416666666666667 | 0 |
| 0.842361111111111 | 0 |
| 0.8430555555555556 | 0 |
| 0.84375 | 0 |
| 0.8444444444444444 | 0 |
| 0.845138888888889 | 0 |
| 0.8458333333333333 | 0 |
| 0.8465277777777778 | 0 |
| 0.8472222222222222 | 0 |
| 0.8479166666666668 | 0 |
| 0.8486111111111111 | 0 |
| 0.8493055555555555 | 0 |
| 0.85 | 0 |
| 0.8506944444444445 | 0 |
| 0.8513888888888889 | 0 |
| 0.8520833333333333 | 0 |
| 0.8527777777777777 | 0 |
| 0.8534722222222223 | 0 |
| 0.8541666666666666 | 0 |
| 0.8548611111111111 | 0 |
| 0.8555555555555556 | 0 |
| 0.8562500000000001 | 0 |
| 0.8569444444444444 | 0 |
| 0.8576388888888888 | 0 |
| 0.8583333333333334 | 0 |
| 0.8590277777777778 | 0 |
| 0.8597222222222222 | 0 |
| 0.8604166666666666 | 0 |
| 0.8611111111111112 | 0 |
| 0.8618055555555556 | 0 |
| 0.8624999999999999 | 0 |
| 0.8631944444444444 | 0 |
| 0.8638888888888889 | 0 |
| 0.8645833333333334 | 0 |
| 0.8652777777777777 | 0 |
| 0.8659722222222223 | 0 |
| 0.8666666666666667 | 0 |
| 0.8673611111111111 | 0 |
| 0.8680555555555555 | 0 |
| 0.86875 | 0 |
| 0.8694444444444445 | 0 |
| 0.8701388888888889 | 0 |
| 0.8708333333333332 | 0 |
| 0.8715277777777778 | 0 |
| 0.8722222222222222 | 0 |
| 0.8729166666666667 | 0 |
| 0.873611111111111 | 0 |
| 0.8743055555555556 | 0 |
| 0.875 | 0 |
| 0.8756944444444444 | 0 |
| 0.876388888888889 | 0 |
| 0.8770833333333333 | 0 |
| 0.8777777777777778 | 0 |
| 0.8784722222222222 | 0 |
| 0.8791666666666668 | 0 |
| 0.8798611111111111 | 0 |
| 0.8805555555555555 | 0 |
| 0.88125 | 0 |
| 0.8819444444444445 | 0 |
| 0.8826388888888889 | 0 |
| 0.8833333333333333 | 0 |
| 0.8840277777777777 | 0 |
| 0.8847222222222223 | 0 |
| 0.8854166666666666 | 0 |
| 0.8861111111111111 | 0 |
| 0.8868055555555556 | 0 |
| 0.8875000000000001 | 0 |
| 0.8881944444444444 | 0 |
| 0.8888888888888888 | 0 |
| 0.8895833333333334 | 0 |
| 0.8902777777777778 | 0 |
| 0.8909722222222222 | 0 |
| 0.8916666666666666 | 0 |
| 0.8923611111111112 | 0 |
| 0.8930555555555556 | 0 |
| 0.8937499999999999 | 0 |
| 0.8944444444444444 | 0 |
| 0.8951388888888889 | 0 |
| 0.8958333333333334 | 0 |
| 0.8965277777777777 | 0 |
| 0.8972222222222223 | 0 |
| 0.8979166666666667 | 0 |
| 0.8986111111111111 | 0 |
| 0.8993055555555555 | 0 |
| 0.9 | 0 |
| 0.9006944444444445 | 0 |
| 0.9013888888888889 | 0 |
| 0.9020833333333332 | 0 |
| 0.9027777777777778 | 0 |
| 0.9034722222222222 | 0 |
| 0.9041666666666667 | 0 |
| 0.904861111111111 | 0 |
| 0.9055555555555556 | 0 |
| 0.90625 | 0 |
| 0.9069444444444444 | 0 |
| 0.907638888888889 | 0 |
| 0.9083333333333333 | 0 |
| 0.9090277777777778 | 0 |
| 0.9097222222222222 | 0 |
| 0.9104166666666668 | 0 |
| 0.9111111111111111 | 0 |
| 0.9118055555555555 | 0 |
| 0.9125 | 0 |
| 0.9131944444444445 | 0 |
| 0.9138888888888889 | 0 |
| 0.9145833333333333 | 0 |
| 0.9152777777777777 | 0 |
| 0.9159722222222223 | 0 |
| 0.9166666666666666 | 0 |
| 0.9173611111111111 | 0 |
| 0.9180555555555556 | 0 |
| 0.9187500000000001 | 0 |
| 0.9194444444444444 | 0 |
| 0.9201388888888888 | 0 |
| 0.9208333333333334 | 0 |
| 0.9215277777777778 | 0 |
| 0.9222222222222222 | 0 |
| 0.9229166666666666 | 0 |
| 0.9236111111111112 | 0 |
| 0.9243055555555556 | 0 |
| 0.9249999999999999 | 0 |
| 0.9256944444444444 | 0 |
| 0.9263888888888889 | 0 |
| 0.9270833333333334 | 0 |
| 0.9277777777777777 | 0 |
| 0.9284722222222223 | 0 |
| 0.9291666666666667 | 0 |
| 0.9298611111111111 | 0 |
| 0.9305555555555555 | 0 |
| 0.93125 | 0 |
| 0.9319444444444445 | 0 |
| 0.9326388888888889 | 0 |
| 0.9333333333333332 | 0 |
| 0.9340277777777778 | 0 |
| 0.9347222222222222 | 0 |
| 0.9354166666666667 | 0 |
| 0.936111111111111 | 0 |
| 0.9368055555555556 | 0 |
| 0.9375 | 0 |
| 0.9381944444444444 | 0 |
| 0.938888888888889 | 0 |
| 0.9395833333333333 | 0 |
| 0.9402777777777778 | 0 |
| 0.9409722222222222 | 0 |
| 0.9416666666666668 | 0 |
| 0.9423611111111111 | 0 |
| 0.9430555555555555 | 0 |
| 0.94375 | 0 |
| 0.9444444444444445 | 0 |
| 0.9451388888888889 | 0 |
| 0.9458333333333333 | 0 |
| 0.9465277777777777 | 0 |
| 0.9472222222222223 | 0 |
| 0.9479166666666666 | 0 |
| 0.9486111111111111 | 0 |
| 0.9493055555555556 | 0 |
| 0.9500000000000001 | 0 |
| 0.9506944444444444 | 0 |
| 0.9513888888888888 | 0 |
| 0.9520833333333334 | 0 |
| 0.9527777777777778 | 0 |
| 0.9534722222222222 | 0 |
| 0.9541666666666666 | 0 |
| 0.9548611111111112 | 0 |
| 0.9555555555555556 | 0 |
| 0.9562499999999999 | 0 |
| 0.9569444444444444 | 0 |
| 0.9576388888888889 | 0 |
| 0.9583333333333334 | 0 |
| 0.9590277777777777 | 0 |
| 0.9597222222222223 | 0 |
| 0.9604166666666667 | 0 |
| 0.9611111111111111 | 0 |
| 0.9618055555555555 | 0 |
| 0.9625 | 0 |
| 0.9631944444444445 | 0 |
| 0.9638888888888889 | 0 |
| 0.9645833333333332 | 0 |
| 0.9652777777777778 | 0 |
| 0.9659722222222222 | 0 |
| 0.9666666666666667 | 0 |
| 0.967361111111111 | 0 |
| 0.9680555555555556 | 0 |
| 0.96875 | 0 |
| 0.9694444444444444 | 0 |
| 0.970138888888889 | 0 |
| 0.9708333333333333 | 0 |
| 0.9715277777777778 | 0 |
| 0.9722222222222222 | 0 |
| 0.9729166666666668 | 0 |
| 0.9736111111111111 | 0 |
| 0.9743055555555555 | 0 |
| 0.975 | 0 |
| 0.9756944444444445 | 0 |
| 0.9763888888888889 | 0 |
| 0.9770833333333333 | 0 |
| 0.9777777777777777 | 0 |
| 0.9784722222222223 | 0 |
| 0.9791666666666666 | 0 |
| 0.9798611111111111 | 0 |
| 0.9805555555555556 | 0 |
| 0.9812500000000001 | 0 |
| 0.9819444444444444 | 0 |
| 0.9826388888888888 | 0 |
| 0.9833333333333334 | 0 |
| 0.9840277777777778 | 0 |
| 0.9847222222222222 | 0 |
| 0.9854166666666666 | 0 |
| 0.9861111111111112 | 0 |
| 0.9868055555555556 | 0 |
| 0.9874999999999999 | 0 |
| 0.9881944444444444 | 0 |
| 0.9888888888888889 | 0 |
| 0.9895833333333334 | 0 |
| 0.9902777777777777 | 0 |
| 0.9909722222222223 | 0 |
| 0.9916666666666667 | 0 |
| 0.9923611111111111 | 0 |
| 0.9930555555555555 | 0 |
| 0.99375 | 0 |
| 0.9944444444444445 | 0 |
| 0.9951388888888889 | 0 |
| 0.9958333333333332 | 0 |
| 0.9965277777777778 | 0 |
| 0.9972222222222222 | 0 |
| 0.9979166666666667 | 0 |
| 0.998611111111111 | 0 |
| 0.9993055555555556 | 0 |